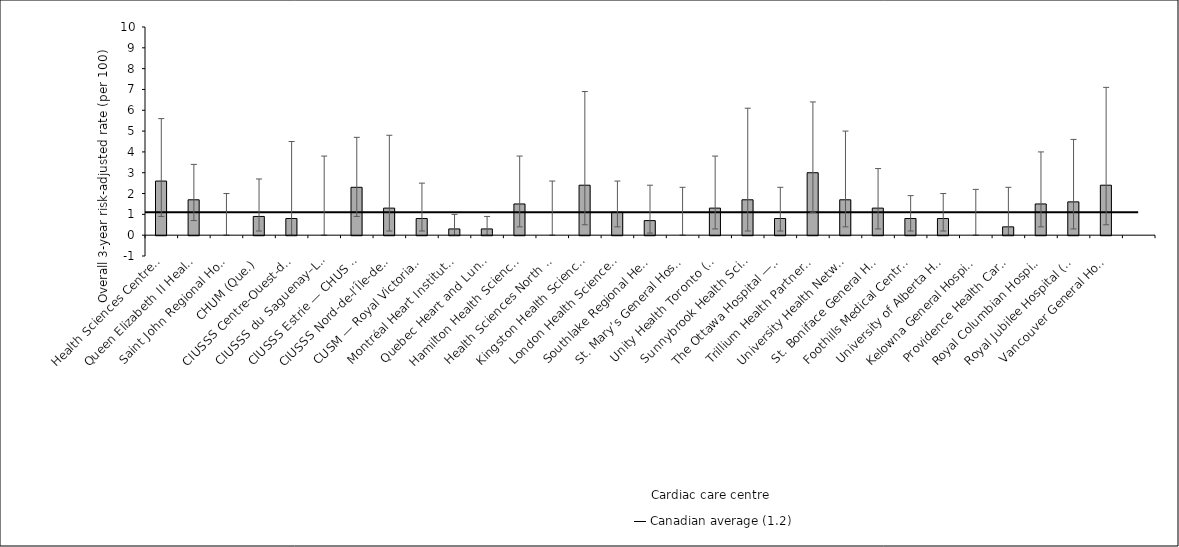
| Category | Risk-adjusted rate |
|---|---|
| Health Sciences Centre, St. John’s (N.L.) | 2.6 |
| Queen Elizabeth II Health Sciences Centre (N.S.) | 1.7 |
| Saint John Regional Hospital (N.B.) | 0 |
| CHUM (Que.) | 0.9 |
| CIUSSS Centre-Ouest-de-l’Île-de-Montréal — Jewish General Hospital (Que.) | 0.8 |
| CIUSSS du Saguenay–Lac-St-Jean — Chicoutimi Hospital (Que.) | 0 |
| CIUSSS Estrie — CHUS — Fleurimont Hospital (Que.) | 2.3 |
| CIUSSS Nord-de-l’Île-de-Montréal — Montréal Sacré-Coeur Hospital (Que.) | 1.3 |
| CUSM — Royal Victoria Hospital (Que.) | 0.8 |
| Montréal Heart Institute* (Que.) | 0.3 |
| Quebec Heart and Lung Institute* (Que.) | 0.3 |
| Hamilton Health Sciences (Ont.) | 1.5 |
| Health Sciences North / Horizon Santé-Nord (Ont.) | 0 |
| Kingston Health Sciences Centre (Ont.) | 2.4 |
| London Health Sciences Centre (Ont.) | 1.1 |
| Southlake Regional Health Centre (Ont.) | 0.7 |
| St. Mary’s General Hospital (Ont.) | 0 |
| Unity Health Toronto (Ont.) | 1.3 |
| Sunnybrook Health Sciences Centre (Ont.) | 1.7 |
| The Ottawa Hospital — University of Ottawa Heart Institute (Ont.) | 0.8 |
| Trillium Health Partners (Ont.) | 3 |
| University Health Network (Ont.) | 1.7 |
| St. Boniface General Hospital (Man.) | 1.3 |
| Foothills Medical Centre (Alta.) | 0.8 |
| University of Alberta Hospital (Alta.) | 0.8 |
| Kelowna General Hospital (B.C.) | 0 |
| Providence Health Care — St. Paul’s Hospital (Vancouver) (B.C.) | 0.4 |
| Royal Columbian Hospital (B.C.) | 1.5 |
| Royal Jubilee Hospital (B.C.) | 1.6 |
| Vancouver General Hospital (B.C.) | 2.4 |